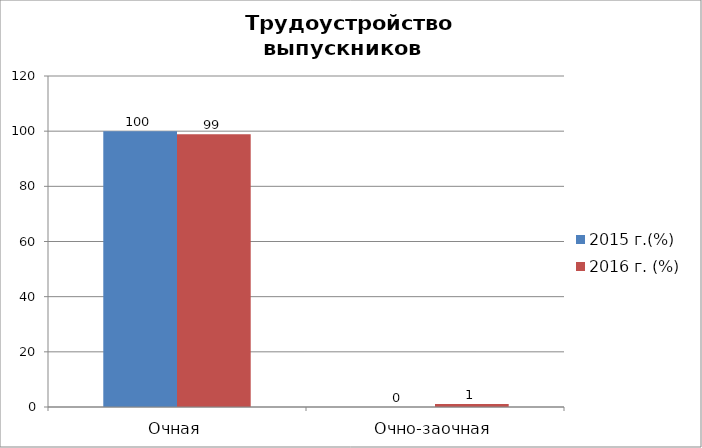
| Category | 2015 г.(%) | 2016 г. (%) |
|---|---|---|
| Очная | 100 | 98.876 |
| Очно-заочная | 0 | 1.124 |